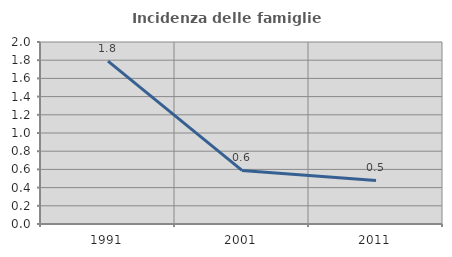
| Category | Incidenza delle famiglie numerose |
|---|---|
| 1991.0 | 1.791 |
| 2001.0 | 0.589 |
| 2011.0 | 0.479 |